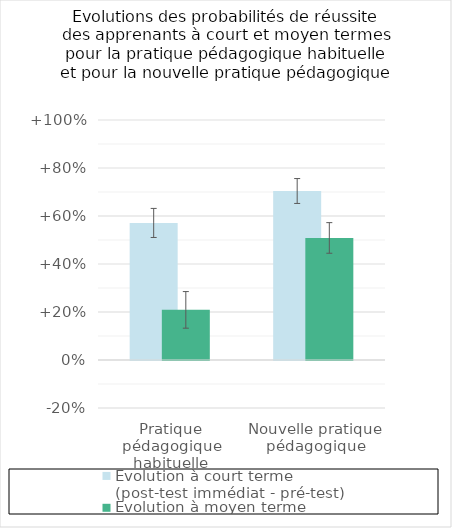
| Category | Evolution à court terme
(post-test immédiat - pré-test) | Evolution à moyen terme
(post-test différé - pré-test) |
|---|---|---|
| Pratique pédagogique habituelle | 0.571 | 0.209 |
| Nouvelle pratique pédagogique | 0.704 | 0.509 |